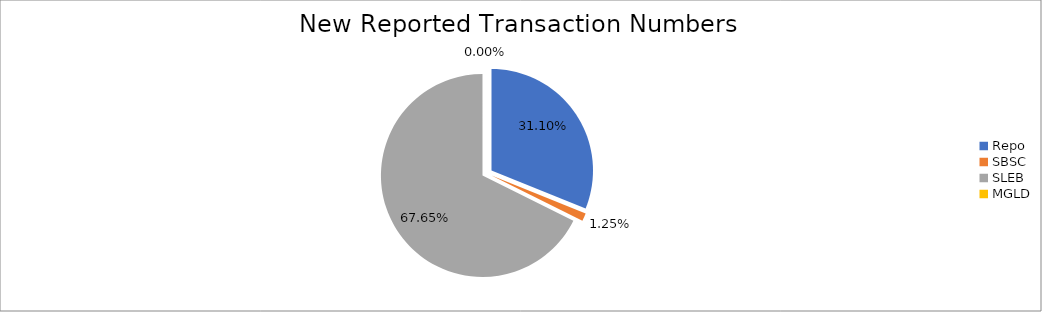
| Category | Series 0 |
|---|---|
| Repo | 288319 |
| SBSC | 11607 |
| SLEB | 627160 |
| MGLD | 31 |